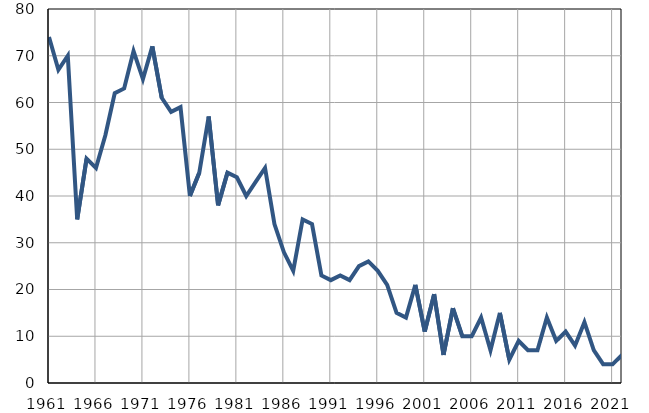
| Category | Умрла 
одојчад |
|---|---|
| 1961.0 | 74 |
| 1962.0 | 67 |
| 1963.0 | 70 |
| 1964.0 | 35 |
| 1965.0 | 48 |
| 1966.0 | 46 |
| 1967.0 | 53 |
| 1968.0 | 62 |
| 1969.0 | 63 |
| 1970.0 | 71 |
| 1971.0 | 65 |
| 1972.0 | 72 |
| 1973.0 | 61 |
| 1974.0 | 58 |
| 1975.0 | 59 |
| 1976.0 | 40 |
| 1977.0 | 45 |
| 1978.0 | 57 |
| 1979.0 | 38 |
| 1980.0 | 45 |
| 1981.0 | 44 |
| 1982.0 | 40 |
| 1983.0 | 43 |
| 1984.0 | 46 |
| 1985.0 | 34 |
| 1986.0 | 28 |
| 1987.0 | 24 |
| 1988.0 | 35 |
| 1989.0 | 34 |
| 1990.0 | 23 |
| 1991.0 | 22 |
| 1992.0 | 23 |
| 1993.0 | 22 |
| 1994.0 | 25 |
| 1995.0 | 26 |
| 1996.0 | 24 |
| 1997.0 | 21 |
| 1998.0 | 15 |
| 1999.0 | 14 |
| 2000.0 | 21 |
| 2001.0 | 11 |
| 2002.0 | 19 |
| 2003.0 | 6 |
| 2004.0 | 16 |
| 2005.0 | 10 |
| 2006.0 | 10 |
| 2007.0 | 14 |
| 2008.0 | 7 |
| 2009.0 | 15 |
| 2010.0 | 5 |
| 2011.0 | 9 |
| 2012.0 | 7 |
| 2013.0 | 7 |
| 2014.0 | 14 |
| 2015.0 | 9 |
| 2016.0 | 11 |
| 2017.0 | 8 |
| 2018.0 | 13 |
| 2019.0 | 7 |
| 2020.0 | 4 |
| 2021.0 | 4 |
| 2022.0 | 6 |